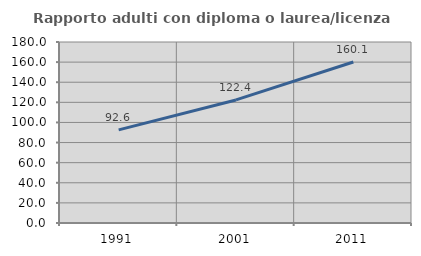
| Category | Rapporto adulti con diploma o laurea/licenza media  |
|---|---|
| 1991.0 | 92.636 |
| 2001.0 | 122.379 |
| 2011.0 | 160.096 |